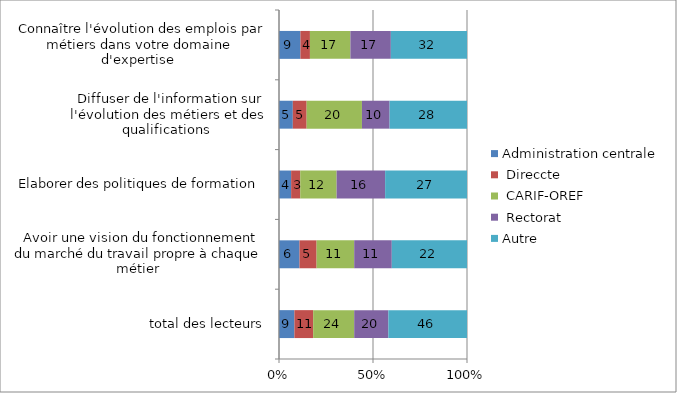
| Category | Administration centrale |  Direccte  |  CARIF-OREF  |  Rectorat  | Autre |
|---|---|---|---|---|---|
| total des lecteurs | 9 | 11 | 24 | 20 | 46 |
|  Avoir une vision du fonctionnement du marché du travail propre à chaque métier  | 6 | 5 | 11 | 11 | 22 |
|  Elaborer des politiques de formation  | 4 | 3 | 12 | 16 | 27 |
|  Diffuser de l'information sur l'évolution des métiers et des qualifications  | 5 | 5 | 20 | 10 | 28 |
|  Connaître l'évolution des emplois par métiers dans votre domaine d'expertise  | 9 | 4 | 17 | 17 | 32 |